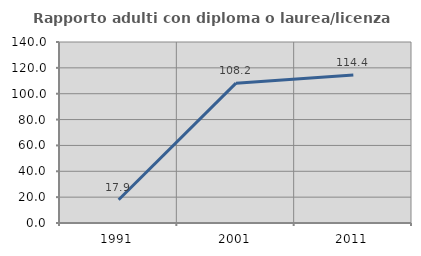
| Category | Rapporto adulti con diploma o laurea/licenza media  |
|---|---|
| 1991.0 | 17.949 |
| 2001.0 | 108.163 |
| 2011.0 | 114.394 |